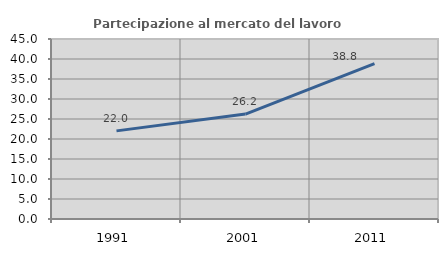
| Category | Partecipazione al mercato del lavoro  femminile |
|---|---|
| 1991.0 | 22.034 |
| 2001.0 | 26.23 |
| 2011.0 | 38.843 |